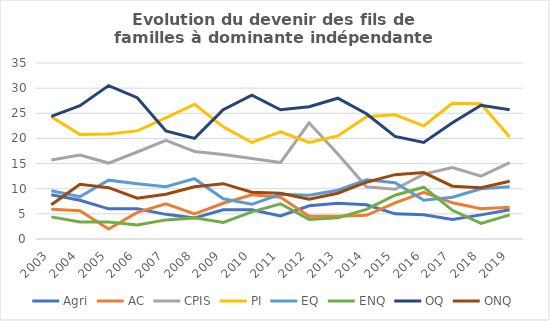
| Category | Agri | AC | CPIS | PI | EQ | ENQ | OQ | ONQ |
|---|---|---|---|---|---|---|---|---|
| 2003.0 | 8.8 | 5.9 | 15.7 | 24.3 | 9.6 | 4.4 | 24.4 | 6.8 |
| 2004.0 | 7.7 | 5.6 | 16.7 | 20.8 | 8.4 | 3.4 | 26.5 | 10.9 |
| 2005.0 | 6 | 2 | 15.1 | 20.9 | 11.7 | 3.4 | 30.5 | 10.2 |
| 2006.0 | 6 | 5.3 | 17.3 | 21.5 | 11 | 2.8 | 28.1 | 8.1 |
| 2007.0 | 4.9 | 7 | 19.6 | 24.1 | 10.4 | 3.8 | 21.5 | 8.9 |
| 2008.0 | 4.2 | 5 | 17.4 | 26.8 | 12 | 4.2 | 20 | 10.4 |
| 2009.0 | 5.8 | 7.1 | 16.8 | 22.3 | 8 | 3.3 | 25.7 | 11 |
| 2010.0 | 5.8 | 8.8 | 16 | 19.2 | 6.9 | 5.4 | 28.6 | 9.3 |
| 2011.0 | 4.6 | 8.3 | 15.2 | 21.3 | 8.9 | 7 | 25.7 | 9.1 |
| 2012.0 | 6.6 | 4.5 | 23.1 | 19.2 | 8.7 | 3.9 | 26.3 | 7.9 |
| 2013.0 | 7.1 | 4.5 | 16.9 | 20.5 | 9.7 | 4.2 | 28 | 9.1 |
| 2014.0 | 6.8 | 4.7 | 10.4 | 24.3 | 11.8 | 5.9 | 24.9 | 11.3 |
| 2015.0 | 5 | 7.2 | 9.9 | 24.7 | 11.2 | 8.7 | 20.4 | 12.8 |
| 2016.0 | 4.8 | 9.3 | 12.9 | 22.5 | 7.7 | 10.3 | 19.2 | 13.2 |
| 2017.0 | 3.9 | 7.2 | 14.2 | 27 | 8.3 | 5.7 | 23.1 | 10.5 |
| 2018.0 | 4.8 | 6 | 12.5 | 26.9 | 10 | 3.1 | 26.6 | 10.2 |
| 2019.0 | 5.8 | 6.3 | 15.2 | 20.3 | 10.4 | 4.8 | 25.7 | 11.5 |